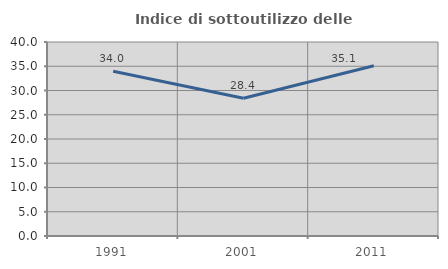
| Category | Indice di sottoutilizzo delle abitazioni  |
|---|---|
| 1991.0 | 33.981 |
| 2001.0 | 28.409 |
| 2011.0 | 35.102 |